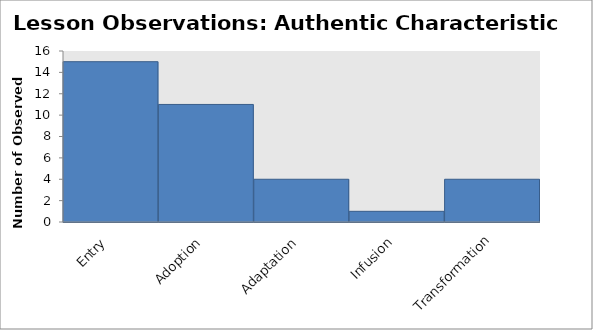
| Category | Lessons |
|---|---|
| Entry | 15 |
| Adoption | 11 |
| Adaptation | 4 |
| Infusion | 1 |
| Transformation | 4 |